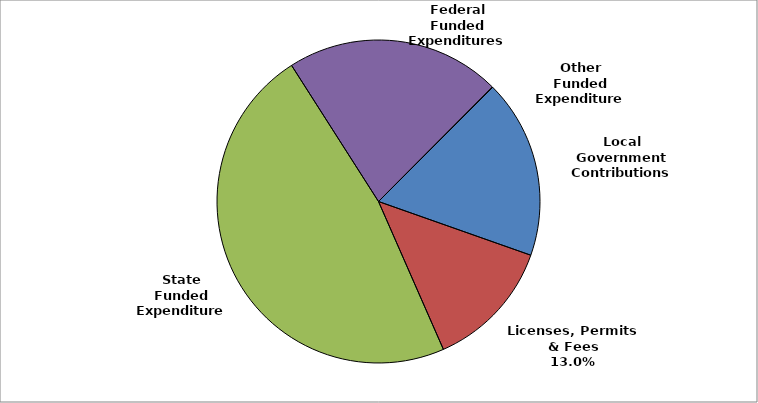
| Category | Series 0 |
|---|---|
| Local Government Contributions | 0.179 |
| Licenses, Permits & Fees | 0.13 |
| State Funded Expenditures | 0.475 |
| Federal Funded Expenditures | 0.215 |
| Other Funded Expenditures | 0 |